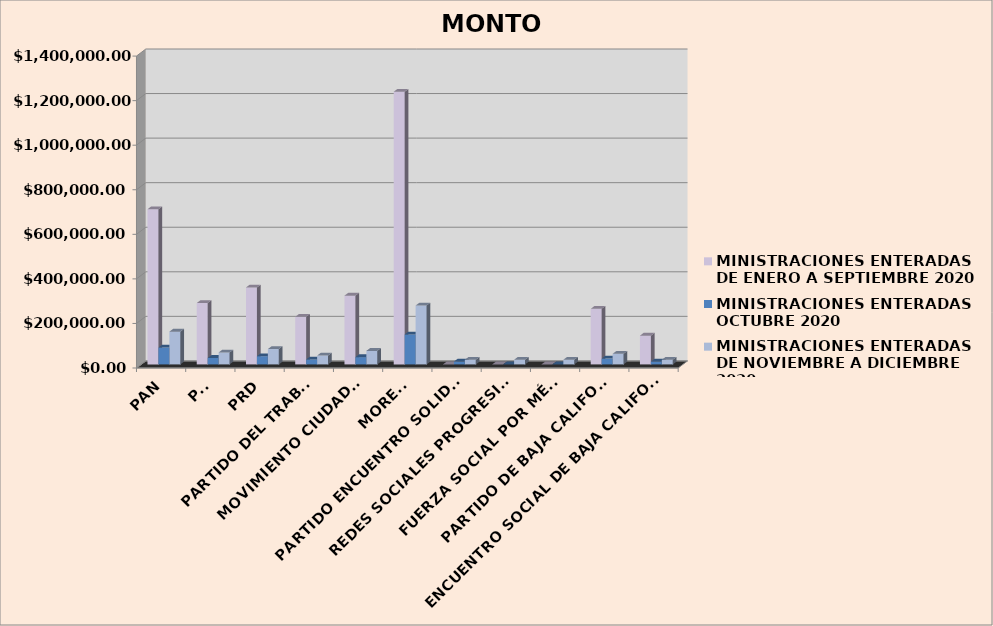
| Category | MINISTRACIONES ENTERADAS 
DE ENERO A SEPTIEMBRE 2020 | MINISTRACIONES ENTERADAS 
OCTUBRE 2020 | MINISTRACIONES ENTERADAS 
DE NOVIEMBRE A DICIEMBRE 2020 |
|---|---|---|---|
| PAN | 696447.94 | 75789.62 | 146943.66 |
| PRI | 275564.4 | 29024.78 | 53413.98 |
| PRD | 345314.05 | 36774.74 | 68913.9 |
| PARTIDO DEL TRABAJO | 213608.3 | 22140.77 | 39645.96 |
| MOVIMIENTO CIUDADANO | 308568.01 | 32691.85 | 60748.11 |
| MORENA | 1223923.63 | 134398.03 | 264160.47 |
| PARTIDO ENCUENTRO SOLIDARIO | 0 | 12747.87 | 20860.14 |
| REDES SOCIALES PROGRESISTAS | 0 | 0 | 20860.14 |
| FUERZA SOCIAL POR MÉXICO | 0 | 0 | 20860.14 |
| PARTIDO DE BAJA CALIFORNIA | 249425.17 | 26120.42 | 47605.26 |
| ENCUENTRO SOCIAL DE BAJA CALIFORNIA | 129072.14 | 12747.87 | 20860.14 |